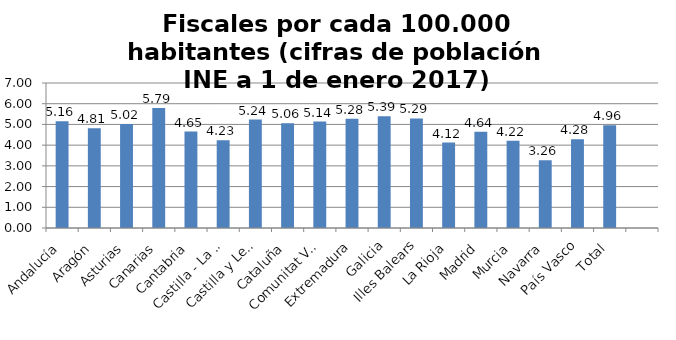
| Category | Fiscales por cada 100.000 habitantes |
|---|---|
| Andalucía | 5.157 |
| Aragón | 4.814 |
| Asturias | 5.024 |
| Canarias | 5.787 |
| Cantabria | 4.653 |
| Castilla - La Mancha | 4.233 |
| Castilla y León | 5.235 |
| Cataluña | 5.056 |
| Comunitat Valenciana | 5.14 |
| Extremadura | 5.278 |
| Galicia | 5.391 |
| Illes Balears | 5.287 |
| La Rioja | 4.122 |
| Madrid | 4.641 |
| Murcia | 4.217 |
| Navarra | 3.265 |
| País Vasco | 4.284 |
| Total | 4.956 |